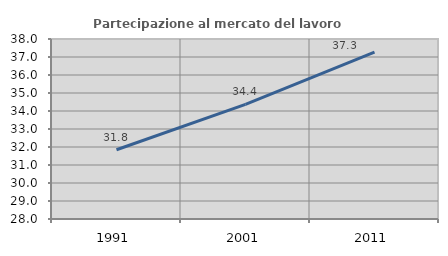
| Category | Partecipazione al mercato del lavoro  femminile |
|---|---|
| 1991.0 | 31.848 |
| 2001.0 | 34.369 |
| 2011.0 | 37.268 |